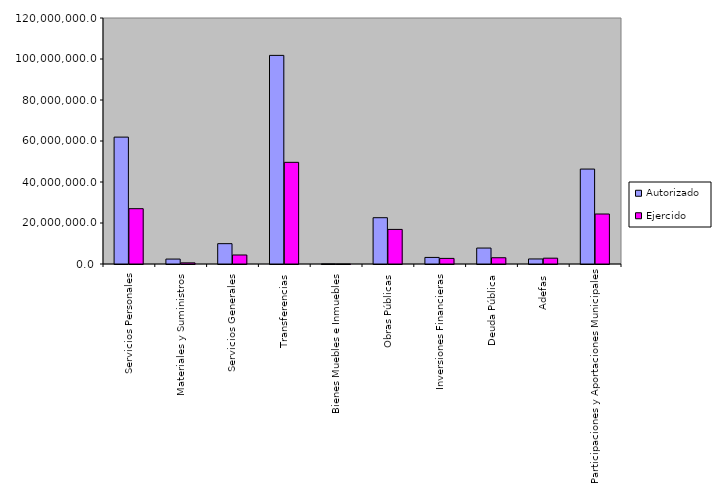
| Category | Autorizado | Ejercido |
|---|---|---|
| 0 | 61894238.6 | 26982735.3 |
| 1 | 2406740.8 | 560832.2 |
| 2 | 9921790.3 | 4394215.6 |
| 3 | 101767959.8 | 49595385.4 |
| 4 | 60079.2 | 210 |
| 5 | 22577852.5 | 16870383.2 |
| 6 | 3206035.1 | 2734827.3 |
| 7 | 7776765.5 | 3050539.3 |
| 8 | 2460661.3 | 2840775.2 |
| 9 | 46303728.5 | 24386765.4 |